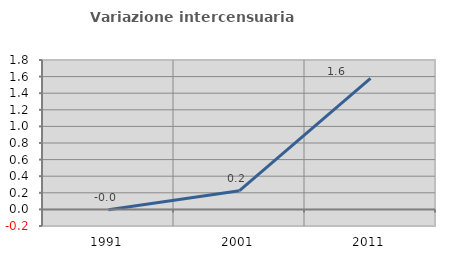
| Category | Variazione intercensuaria annua |
|---|---|
| 1991.0 | -0.005 |
| 2001.0 | 0.225 |
| 2011.0 | 1.578 |